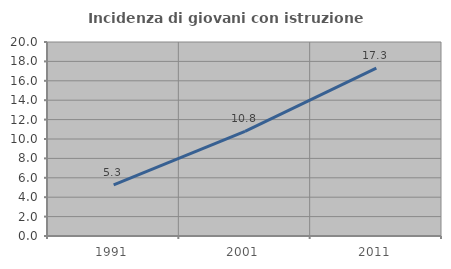
| Category | Incidenza di giovani con istruzione universitaria |
|---|---|
| 1991.0 | 5.276 |
| 2001.0 | 10.794 |
| 2011.0 | 17.299 |